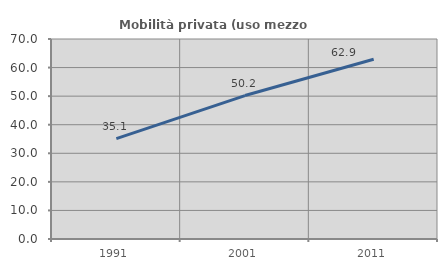
| Category | Mobilità privata (uso mezzo privato) |
|---|---|
| 1991.0 | 35.145 |
| 2001.0 | 50.204 |
| 2011.0 | 62.929 |